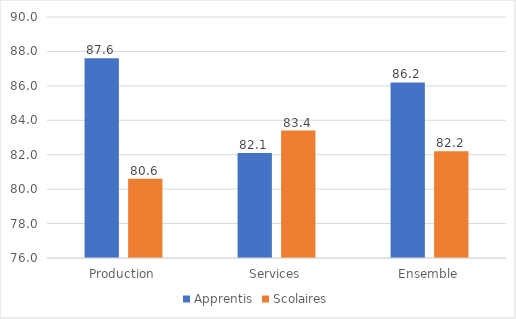
| Category | Apprentis | Scolaires |
|---|---|---|
| Production | 87.6 | 80.6 |
| Services | 82.1 | 83.4 |
| Ensemble | 86.2 | 82.2 |